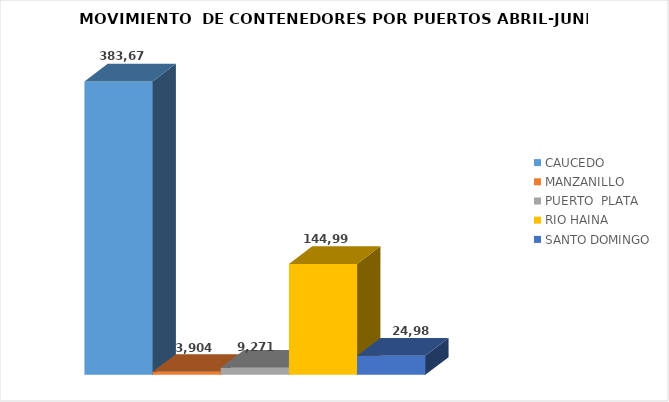
| Category | CAUCEDO | MANZANILLO | PUERTO  PLATA | RIO HAINA | SANTO DOMINGO |
|---|---|---|---|---|---|
| 0 | 383670 | 3904 | 9271 | 144998 | 24982 |